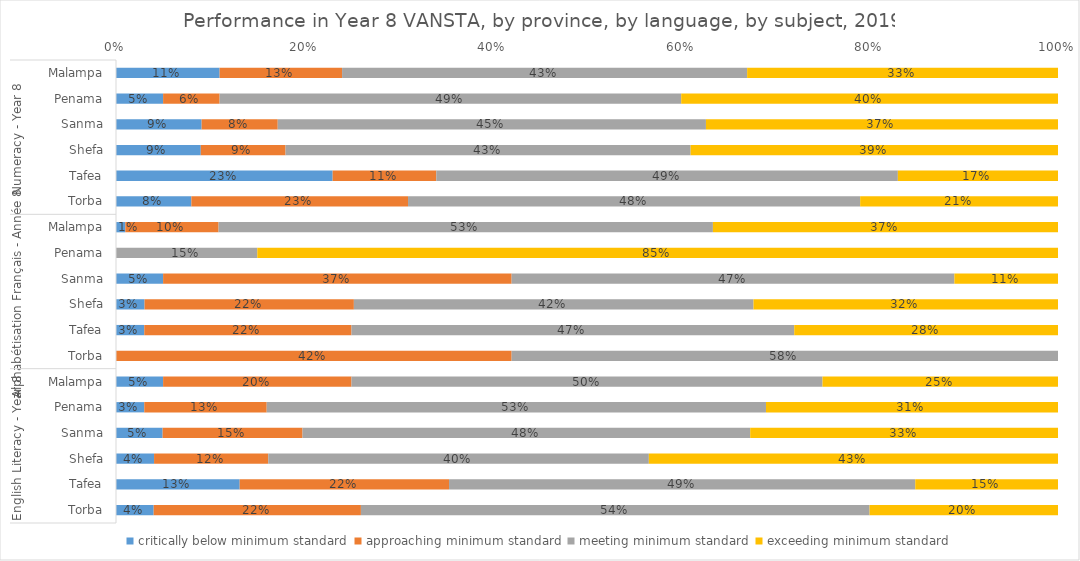
| Category | critically below minimum standard | approaching minimum standard | meeting minimum standard | exceeding minimum standard |
|---|---|---|---|---|
| 0 | 0.11 | 0.13 | 0.43 | 0.33 |
| 1 | 0.05 | 0.06 | 0.49 | 0.4 |
| 2 | 0.09 | 0.08 | 0.45 | 0.37 |
| 3 | 0.09 | 0.09 | 0.43 | 0.39 |
| 4 | 0.23 | 0.11 | 0.49 | 0.17 |
| 5 | 0.08 | 0.23 | 0.48 | 0.21 |
| 6 | 0.01 | 0.1 | 0.53 | 0.37 |
| 7 | 0 | 0 | 0.15 | 0.85 |
| 8 | 0.05 | 0.37 | 0.47 | 0.11 |
| 9 | 0.03 | 0.22 | 0.42 | 0.32 |
| 10 | 0.03 | 0.22 | 0.47 | 0.28 |
| 11 | 0 | 0.42 | 0.58 | 0 |
| 12 | 0.05 | 0.2 | 0.5 | 0.25 |
| 13 | 0.03 | 0.13 | 0.53 | 0.31 |
| 14 | 0.05 | 0.15 | 0.48 | 0.33 |
| 15 | 0.04 | 0.12 | 0.4 | 0.43 |
| 16 | 0.13 | 0.22 | 0.49 | 0.15 |
| 17 | 0.04 | 0.22 | 0.54 | 0.2 |